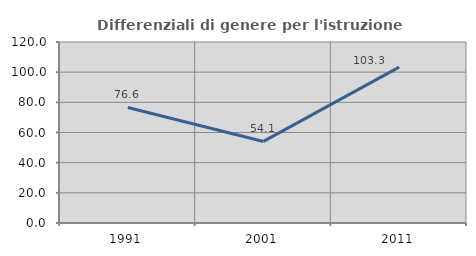
| Category | Differenziali di genere per l'istruzione superiore |
|---|---|
| 1991.0 | 76.578 |
| 2001.0 | 54.08 |
| 2011.0 | 103.306 |